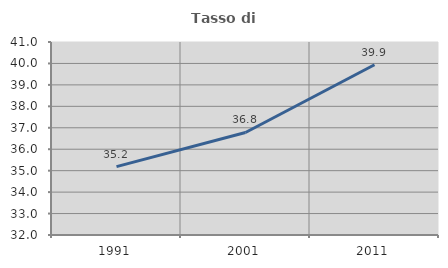
| Category | Tasso di occupazione   |
|---|---|
| 1991.0 | 35.19 |
| 2001.0 | 36.782 |
| 2011.0 | 39.937 |